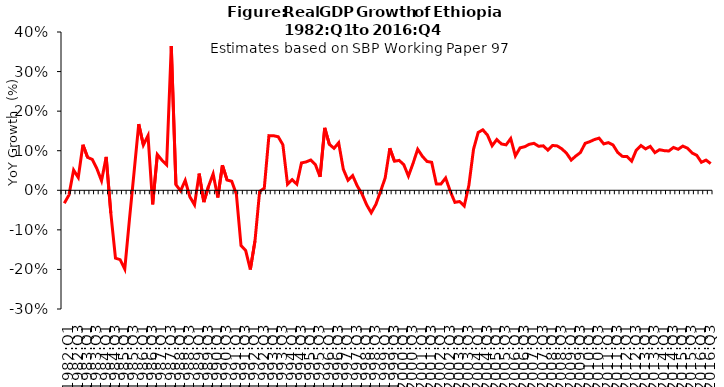
| Category | Series 0 |
|---|---|
| 1982:Q1 | -0.033 |
| 1982:Q2 | -0.012 |
| 1982:Q3 | 0.051 |
| 1982:Q4 | 0.032 |
| 1983:Q1 | 0.115 |
| 1983:Q2 | 0.083 |
| 1983:Q3 | 0.078 |
| 1983:Q4 | 0.055 |
| 1984:Q1 | 0.024 |
| 1984:Q2 | 0.084 |
| 1984:Q3 | -0.058 |
| 1984:Q4 | -0.171 |
| 1985:Q1 | -0.175 |
| 1985:Q2 | -0.199 |
| 1985:Q3 | -0.074 |
| 1985:Q4 | 0.046 |
| 1986:Q1 | 0.167 |
| 1986:Q2 | 0.115 |
| 1986:Q3 | 0.138 |
| 1986:Q4 | -0.035 |
| 1987:Q1 | 0.09 |
| 1987:Q2 | 0.076 |
| 1987:Q3 | 0.065 |
| 1987:Q4 | 0.365 |
| 1988:Q1 | 0.014 |
| 1988:Q2 | -0.001 |
| 1988:Q3 | 0.025 |
| 1988:Q4 | -0.016 |
| 1989:Q1 | -0.037 |
| 1989:Q2 | 0.042 |
| 1989:Q3 | -0.03 |
| 1989:Q4 | 0.01 |
| 1990:Q1 | 0.041 |
| 1990:Q2 | -0.018 |
| 1990:Q3 | 0.063 |
| 1990:Q4 | 0.026 |
| 1991:Q1 | 0.023 |
| 1991:Q2 | -0.01 |
| 1991:Q3 | -0.14 |
| 1991:Q4 | -0.152 |
| 1992:Q1 | -0.2 |
| 1992:Q2 | -0.128 |
| 1992:Q3 | -0.003 |
| 1992:Q4 | 0.005 |
| 1993:Q1 | 0.138 |
| 1993:Q2 | 0.138 |
| 1993:Q3 | 0.135 |
| 1993:Q4 | 0.115 |
| 1994:Q1 | 0.015 |
| 1994:Q2 | 0.027 |
| 1994:Q3 | 0.015 |
| 1994:Q4 | 0.069 |
| 1995:Q1 | 0.072 |
| 1995:Q2 | 0.077 |
| 1995:Q3 | 0.065 |
| 1995:Q4 | 0.034 |
| 1996:Q1 | 0.158 |
| 1996:Q2 | 0.116 |
| 1996:Q3 | 0.106 |
| 1996:Q4 | 0.12 |
| 1997:Q1 | 0.053 |
| 1997:Q2 | 0.026 |
| 1997:Q3 | 0.037 |
| 1997:Q4 | 0.011 |
| 1998:Q1 | -0.009 |
| 1998:Q2 | -0.036 |
| 1998:Q3 | -0.057 |
| 1998:Q4 | -0.036 |
| 1999:Q1 | -0.003 |
| 1999:Q2 | 0.031 |
| 1999:Q3 | 0.106 |
| 1999:Q4 | 0.073 |
| 2000:Q1 | 0.076 |
| 2000:Q2 | 0.065 |
| 2000:Q3 | 0.036 |
| 2000:Q4 | 0.068 |
| 2001:Q1 | 0.104 |
| 2001:Q2 | 0.086 |
| 2001:Q3 | 0.073 |
| 2001:Q4 | 0.071 |
| 2002:Q1 | 0.016 |
| 2002:Q2 | 0.016 |
| 2002:Q3 | 0.031 |
| 2002:Q4 | -0.003 |
| 2003:Q1 | -0.031 |
| 2003:Q2 | -0.028 |
| 2003:Q3 | -0.04 |
| 2003:Q4 | 0.012 |
| 2004:Q1 | 0.104 |
| 2004:Q2 | 0.146 |
| 2004:Q3 | 0.153 |
| 2004:Q4 | 0.139 |
| 2005:Q1 | 0.112 |
| 2005:Q2 | 0.128 |
| 2005:Q3 | 0.117 |
| 2005:Q4 | 0.115 |
| 2006:Q1 | 0.131 |
| 2006:Q2 | 0.087 |
| 2006:Q3 | 0.107 |
| 2006:Q4 | 0.11 |
| 2007:Q1 | 0.116 |
| 2007:Q2 | 0.119 |
| 2007:Q3 | 0.111 |
| 2007:Q4 | 0.112 |
| 2008:Q1 | 0.101 |
| 2008:Q2 | 0.113 |
| 2008:Q3 | 0.112 |
| 2008:Q4 | 0.105 |
| 2009:Q1 | 0.094 |
| 2009:Q2 | 0.076 |
| 2009:Q3 | 0.087 |
| 2009:Q4 | 0.096 |
| 2010:Q1 | 0.119 |
| 2010:Q2 | 0.123 |
| 2010:Q3 | 0.128 |
| 2010:Q4 | 0.132 |
| 2011:Q1 | 0.117 |
| 2011:Q2 | 0.12 |
| 2011:Q3 | 0.115 |
| 2011:Q4 | 0.096 |
| 2012:Q1 | 0.086 |
| 2012:Q2 | 0.085 |
| 2012:Q3 | 0.073 |
| 2012:Q4 | 0.101 |
| 2013:Q1 | 0.113 |
| 2013:Q2 | 0.105 |
| 2013:Q3 | 0.111 |
| 2013:Q4 | 0.095 |
| 2014:Q1 | 0.102 |
| 2014:Q2 | 0.1 |
| 2014:Q3 | 0.099 |
| 2014:Q4 | 0.108 |
| 2015:Q1 | 0.104 |
| 2015:Q2 | 0.112 |
| 2015:Q3 | 0.106 |
| 2015:Q4 | 0.094 |
| 2016:Q1 | 0.089 |
| 2016:Q2 | 0.071 |
| 2016:Q3 | 0.076 |
| 2016:Q4 | 0.067 |